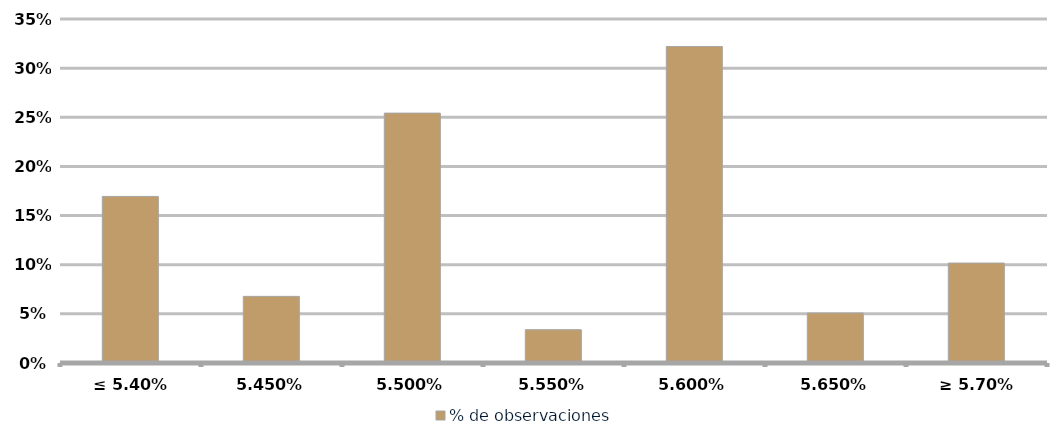
| Category | % de observaciones  |
|---|---|
| ≤ 5.40% | 0.169 |
| 5.45% | 0.068 |
| 5.50% | 0.254 |
| 5.55% | 0.034 |
| 5.60% | 0.322 |
| 5.65% | 0.051 |
| ≥ 5.70% | 0.102 |